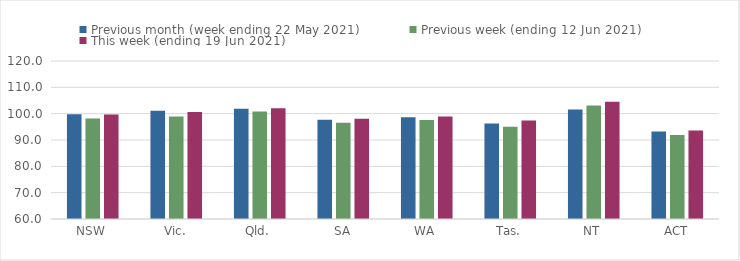
| Category | Previous month (week ending 22 May 2021) | Previous week (ending 12 Jun 2021) | This week (ending 19 Jun 2021) |
|---|---|---|---|
| NSW | 99.75 | 98.2 | 99.69 |
| Vic. | 101.11 | 98.93 | 100.6 |
| Qld. | 101.83 | 100.82 | 102.03 |
| SA | 97.72 | 96.51 | 98.07 |
| WA | 98.66 | 97.57 | 98.89 |
| Tas. | 96.23 | 95.03 | 97.39 |
| NT | 101.59 | 103.14 | 104.52 |
| ACT | 93.25 | 91.93 | 93.61 |